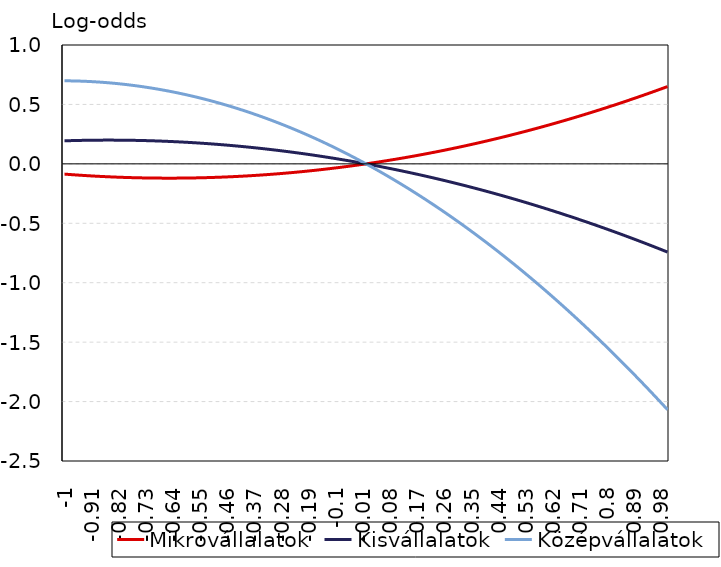
| Category | Mikrovállalatok | Kisvállalatok | Középvállalatok |
|---|---|---|---|
| -1.0 | -0.086 | 0.194 | 0.699 |
| -0.99 | -0.088 | 0.195 | 0.699 |
| -0.98 | -0.09 | 0.195 | 0.698 |
| -0.97 | -0.092 | 0.196 | 0.698 |
| -0.96 | -0.094 | 0.197 | 0.697 |
| -0.95 | -0.095 | 0.197 | 0.696 |
| -0.94 | -0.097 | 0.198 | 0.695 |
| -0.93 | -0.099 | 0.198 | 0.694 |
| -0.92 | -0.1 | 0.199 | 0.693 |
| -0.91 | -0.102 | 0.199 | 0.692 |
| -0.9 | -0.103 | 0.199 | 0.69 |
| -0.89 | -0.104 | 0.199 | 0.689 |
| -0.88 | -0.106 | 0.2 | 0.687 |
| -0.87 | -0.107 | 0.2 | 0.685 |
| -0.86 | -0.108 | 0.2 | 0.683 |
| -0.85 | -0.109 | 0.2 | 0.681 |
| -0.84 | -0.11 | 0.2 | 0.679 |
| -0.83 | -0.111 | 0.2 | 0.677 |
| -0.82 | -0.112 | 0.199 | 0.674 |
| -0.81 | -0.113 | 0.199 | 0.671 |
| -0.8 | -0.114 | 0.199 | 0.669 |
| -0.79 | -0.115 | 0.199 | 0.666 |
| -0.78 | -0.116 | 0.198 | 0.663 |
| -0.77 | -0.116 | 0.198 | 0.659 |
| -0.76 | -0.117 | 0.197 | 0.656 |
| -0.75 | -0.118 | 0.197 | 0.652 |
| -0.74 | -0.118 | 0.196 | 0.649 |
| -0.73 | -0.119 | 0.196 | 0.645 |
| -0.72 | -0.119 | 0.195 | 0.641 |
| -0.71 | -0.119 | 0.194 | 0.637 |
| -0.7 | -0.12 | 0.193 | 0.633 |
| -0.69 | -0.12 | 0.192 | 0.629 |
| -0.68 | -0.12 | 0.191 | 0.624 |
| -0.67 | -0.12 | 0.191 | 0.62 |
| -0.66 | -0.12 | 0.189 | 0.615 |
| -0.65 | -0.12 | 0.188 | 0.61 |
| -0.64 | -0.12 | 0.187 | 0.605 |
| -0.63 | -0.12 | 0.186 | 0.6 |
| -0.62 | -0.12 | 0.185 | 0.595 |
| -0.61 | -0.12 | 0.183 | 0.589 |
| -0.6 | -0.119 | 0.182 | 0.584 |
| -0.59 | -0.119 | 0.181 | 0.578 |
| -0.58 | -0.119 | 0.179 | 0.572 |
| -0.57 | -0.118 | 0.178 | 0.566 |
| -0.56 | -0.118 | 0.176 | 0.56 |
| -0.55 | -0.117 | 0.174 | 0.554 |
| -0.54 | -0.117 | 0.173 | 0.547 |
| -0.53 | -0.116 | 0.171 | 0.541 |
| -0.52 | -0.115 | 0.169 | 0.534 |
| -0.51 | -0.114 | 0.167 | 0.527 |
| -0.5 | -0.114 | 0.165 | 0.521 |
| -0.49 | -0.113 | 0.164 | 0.513 |
| -0.48 | -0.112 | 0.161 | 0.506 |
| -0.47 | -0.111 | 0.159 | 0.499 |
| -0.46 | -0.11 | 0.157 | 0.491 |
| -0.45 | -0.109 | 0.155 | 0.484 |
| -0.44 | -0.107 | 0.153 | 0.476 |
| -0.429999999999999 | -0.106 | 0.151 | 0.468 |
| -0.419999999999999 | -0.105 | 0.148 | 0.46 |
| -0.409999999999999 | -0.104 | 0.146 | 0.452 |
| -0.399999999999999 | -0.102 | 0.143 | 0.444 |
| -0.389999999999999 | -0.101 | 0.141 | 0.435 |
| -0.379999999999999 | -0.099 | 0.138 | 0.427 |
| -0.369999999999999 | -0.098 | 0.136 | 0.418 |
| -0.359999999999999 | -0.096 | 0.133 | 0.409 |
| -0.349999999999999 | -0.094 | 0.13 | 0.4 |
| -0.339999999999999 | -0.093 | 0.127 | 0.391 |
| -0.329999999999999 | -0.091 | 0.125 | 0.382 |
| -0.319999999999999 | -0.089 | 0.122 | 0.373 |
| -0.309999999999999 | -0.087 | 0.119 | 0.363 |
| -0.299999999999999 | -0.085 | 0.116 | 0.353 |
| -0.289999999999999 | -0.083 | 0.113 | 0.344 |
| -0.279999999999999 | -0.081 | 0.11 | 0.334 |
| -0.269999999999999 | -0.079 | 0.106 | 0.324 |
| -0.259999999999999 | -0.077 | 0.103 | 0.313 |
| -0.249999999999999 | -0.074 | 0.1 | 0.303 |
| -0.239999999999999 | -0.072 | 0.097 | 0.293 |
| -0.229999999999999 | -0.07 | 0.093 | 0.282 |
| -0.219999999999999 | -0.067 | 0.09 | 0.271 |
| -0.209999999999999 | -0.065 | 0.086 | 0.26 |
| -0.199999999999999 | -0.062 | 0.083 | 0.249 |
| -0.189999999999999 | -0.06 | 0.079 | 0.238 |
| -0.179999999999999 | -0.057 | 0.075 | 0.227 |
| -0.169999999999999 | -0.054 | 0.072 | 0.215 |
| -0.159999999999999 | -0.052 | 0.068 | 0.204 |
| -0.149999999999999 | -0.049 | 0.064 | 0.192 |
| -0.139999999999999 | -0.046 | 0.06 | 0.18 |
| -0.129999999999999 | -0.043 | 0.056 | 0.168 |
| -0.119999999999999 | -0.04 | 0.052 | 0.156 |
| -0.109999999999999 | -0.037 | 0.048 | 0.144 |
| -0.099999999999999 | -0.034 | 0.044 | 0.131 |
| -0.089999999999999 | -0.031 | 0.04 | 0.119 |
| -0.079999999999999 | -0.028 | 0.036 | 0.106 |
| -0.069999999999999 | -0.024 | 0.031 | 0.093 |
| -0.0599999999999991 | -0.021 | 0.027 | 0.081 |
| -0.049999999999999 | -0.018 | 0.023 | 0.067 |
| -0.039999999999999 | -0.014 | 0.018 | 0.054 |
| -0.029999999999999 | -0.011 | 0.014 | 0.041 |
| -0.019999999999999 | -0.007 | 0.009 | 0.027 |
| -0.00999999999999901 | -0.004 | 0.005 | 0.014 |
| 0.0 | 0 | 0 | 0 |
| 0.01 | 0.004 | -0.005 | -0.014 |
| 0.02 | 0.007 | -0.009 | -0.028 |
| 0.03 | 0.011 | -0.014 | -0.042 |
| 0.04 | 0.015 | -0.019 | -0.056 |
| 0.05 | 0.019 | -0.024 | -0.071 |
| 0.0600000000000001 | 0.023 | -0.029 | -0.085 |
| 0.0700000000000001 | 0.027 | -0.034 | -0.1 |
| 0.0800000000000001 | 0.031 | -0.039 | -0.115 |
| 0.0900000000000001 | 0.035 | -0.044 | -0.13 |
| 0.1 | 0.04 | -0.05 | -0.145 |
| 0.11 | 0.044 | -0.055 | -0.16 |
| 0.12 | 0.048 | -0.06 | -0.176 |
| 0.13 | 0.053 | -0.065 | -0.191 |
| 0.14 | 0.057 | -0.071 | -0.207 |
| 0.15 | 0.062 | -0.076 | -0.223 |
| 0.16 | 0.066 | -0.082 | -0.239 |
| 0.17 | 0.071 | -0.087 | -0.255 |
| 0.18 | 0.075 | -0.093 | -0.271 |
| 0.19 | 0.08 | -0.099 | -0.288 |
| 0.2 | 0.085 | -0.105 | -0.304 |
| 0.21 | 0.09 | -0.11 | -0.321 |
| 0.22 | 0.095 | -0.116 | -0.337 |
| 0.23 | 0.1 | -0.122 | -0.354 |
| 0.24 | 0.105 | -0.128 | -0.371 |
| 0.25 | 0.11 | -0.134 | -0.389 |
| 0.26 | 0.115 | -0.14 | -0.406 |
| 0.27 | 0.12 | -0.146 | -0.423 |
| 0.28 | 0.125 | -0.153 | -0.441 |
| 0.29 | 0.131 | -0.159 | -0.459 |
| 0.3 | 0.136 | -0.165 | -0.477 |
| 0.31 | 0.141 | -0.171 | -0.495 |
| 0.32 | 0.147 | -0.178 | -0.513 |
| 0.33 | 0.152 | -0.184 | -0.531 |
| 0.34 | 0.158 | -0.191 | -0.549 |
| 0.35 | 0.163 | -0.197 | -0.568 |
| 0.36 | 0.169 | -0.204 | -0.587 |
| 0.37 | 0.175 | -0.211 | -0.606 |
| 0.38 | 0.181 | -0.217 | -0.625 |
| 0.39 | 0.187 | -0.224 | -0.644 |
| 0.4 | 0.192 | -0.231 | -0.663 |
| 0.41 | 0.198 | -0.238 | -0.682 |
| 0.42 | 0.204 | -0.245 | -0.702 |
| 0.43 | 0.21 | -0.252 | -0.721 |
| 0.44 | 0.217 | -0.259 | -0.741 |
| 0.45 | 0.223 | -0.266 | -0.761 |
| 0.46 | 0.229 | -0.273 | -0.781 |
| 0.47 | 0.235 | -0.281 | -0.801 |
| 0.48 | 0.242 | -0.288 | -0.822 |
| 0.49 | 0.248 | -0.295 | -0.842 |
| 0.5 | 0.255 | -0.303 | -0.863 |
| 0.51 | 0.261 | -0.31 | -0.884 |
| 0.52 | 0.268 | -0.317 | -0.904 |
| 0.53 | 0.274 | -0.325 | -0.926 |
| 0.54 | 0.281 | -0.333 | -0.947 |
| 0.55 | 0.288 | -0.34 | -0.968 |
| 0.56 | 0.295 | -0.348 | -0.989 |
| 0.57 | 0.302 | -0.356 | -1.011 |
| 0.58 | 0.308 | -0.364 | -1.033 |
| 0.59 | 0.315 | -0.372 | -1.055 |
| 0.6 | 0.322 | -0.379 | -1.077 |
| 0.61 | 0.33 | -0.387 | -1.099 |
| 0.62 | 0.337 | -0.396 | -1.121 |
| 0.63 | 0.344 | -0.404 | -1.143 |
| 0.64 | 0.351 | -0.412 | -1.166 |
| 0.65 | 0.358 | -0.42 | -1.188 |
| 0.66 | 0.366 | -0.428 | -1.211 |
| 0.67 | 0.373 | -0.437 | -1.234 |
| 0.68 | 0.381 | -0.445 | -1.257 |
| 0.69 | 0.388 | -0.453 | -1.281 |
| 0.7 | 0.396 | -0.462 | -1.304 |
| 0.71 | 0.404 | -0.47 | -1.327 |
| 0.72 | 0.411 | -0.479 | -1.351 |
| 0.73 | 0.419 | -0.488 | -1.375 |
| 0.74 | 0.427 | -0.496 | -1.399 |
| 0.75 | 0.435 | -0.505 | -1.423 |
| 0.76 | 0.443 | -0.514 | -1.447 |
| 0.77 | 0.451 | -0.523 | -1.471 |
| 0.78 | 0.459 | -0.532 | -1.496 |
| 0.79 | 0.467 | -0.541 | -1.52 |
| 0.8 | 0.475 | -0.55 | -1.545 |
| 0.81 | 0.483 | -0.559 | -1.57 |
| 0.82 | 0.492 | -0.568 | -1.595 |
| 0.83 | 0.5 | -0.577 | -1.62 |
| 0.84 | 0.508 | -0.587 | -1.645 |
| 0.85 | 0.517 | -0.596 | -1.671 |
| 0.86 | 0.525 | -0.605 | -1.696 |
| 0.87 | 0.534 | -0.615 | -1.722 |
| 0.88 | 0.542 | -0.624 | -1.748 |
| 0.89 | 0.551 | -0.634 | -1.774 |
| 0.9 | 0.56 | -0.643 | -1.8 |
| 0.91 | 0.569 | -0.653 | -1.826 |
| 0.92 | 0.577 | -0.663 | -1.852 |
| 0.93 | 0.586 | -0.672 | -1.879 |
| 0.94 | 0.595 | -0.682 | -1.905 |
| 0.95 | 0.604 | -0.692 | -1.932 |
| 0.96 | 0.613 | -0.702 | -1.959 |
| 0.97 | 0.623 | -0.712 | -1.986 |
| 0.98 | 0.632 | -0.722 | -2.013 |
| 0.99 | 0.641 | -0.732 | -2.041 |
| 1.0 | 0.65 | -0.742 | -2.068 |